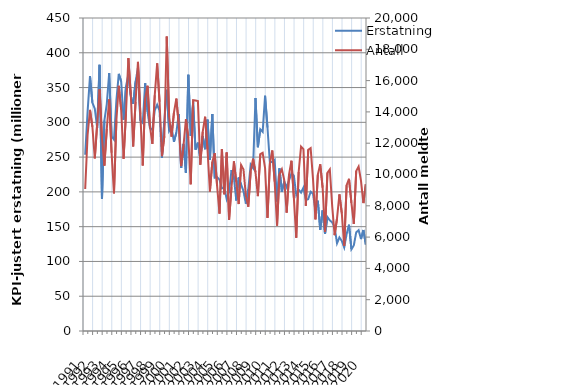
| Category | Erstatning |
|---|---|
| 1991.0 | 253.469 |
| nan | 315.36 |
| nan | 366.519 |
| nan | 328.269 |
| 1992.0 | 319.552 |
| nan | 291.981 |
| nan | 382.641 |
| nan | 189.775 |
| 1993.0 | 302.742 |
| nan | 326.193 |
| nan | 370.855 |
| nan | 280.025 |
| 1994.0 | 275.259 |
| nan | 331.438 |
| nan | 369.692 |
| nan | 358.663 |
| 1995.0 | 303.678 |
| nan | 351.299 |
| nan | 368.914 |
| nan | 337.816 |
| 1996.0 | 326.588 |
| nan | 358.519 |
| nan | 378.266 |
| nan | 302.415 |
| 1997.0 | 298.989 |
| nan | 356.113 |
| nan | 315.206 |
| nan | 291.396 |
| 1998.0 | 289.223 |
| nan | 317.273 |
| nan | 325.337 |
| nan | 316.584 |
| 1999.0 | 248.708 |
| nan | 301.782 |
| nan | 346.828 |
| nan | 287.664 |
| 2000.0 | 293.228 |
| nan | 271.936 |
| nan | 285.248 |
| nan | 311.846 |
| 2001.0 | 234.505 |
| nan | 268.968 |
| nan | 227.131 |
| nan | 368.386 |
| 2002.0 | 280.478 |
| nan | 328.826 |
| nan | 260.77 |
| nan | 270.739 |
| 2003.0 | 247.365 |
| nan | 280.296 |
| nan | 261.363 |
| nan | 303.899 |
| 2004.0 | 246.119 |
| nan | 312.001 |
| nan | 220.435 |
| nan | 221.355 |
| 2005.0 | 217.579 |
| nan | 205.064 |
| nan | 205.915 |
| nan | 189.628 |
| 2006.0 | 200.078 |
| nan | 231.376 |
| nan | 220.674 |
| nan | 187.581 |
| 2007.0 | 220.694 |
| nan | 210.821 |
| nan | 201.064 |
| nan | 183.119 |
| 2008.0 | 203.451 |
| nan | 239.218 |
| nan | 234.438 |
| nan | 334.908 |
| 2009.0 | 264.21 |
| nan | 289.974 |
| nan | 286.344 |
| nan | 338.202 |
| 2010.0 | 292.603 |
| nan | 242.276 |
| nan | 243.27 |
| nan | 246.171 |
| 2011.0 | 186.198 |
| nan | 233.898 |
| nan | 200.278 |
| nan | 214.975 |
| 2012.0 | 206.705 |
| nan | 216.668 |
| nan | 226.437 |
| nan | 223.463 |
| 2013.0 | 195.495 |
| nan | 203.199 |
| nan | 199.023 |
| nan | 206.2 |
| 2014.0 | 188.402 |
| nan | 189.607 |
| nan | 200.172 |
| nan | 197.056 |
| 2015.0 | 173.901 |
| nan | 187.368 |
| nan | 145.441 |
| nan | 173.337 |
| 2016.0 | 139.594 |
| nan | 163.833 |
| nan | 159.014 |
| nan | 156.137 |
| 2017.0 | 149.352 |
| nan | 126.055 |
| nan | 134.611 |
| nan | 129.438 |
| 2018.0 | 120.035 |
| nan | 139.312 |
| nan | 152.844 |
| nan | 117.524 |
| 2019.0 | 123.081 |
| nan | 141.817 |
| nan | 144.981 |
| nan | 132.183 |
| 2020.0 | 145.263 |
| nan | 124.327 |